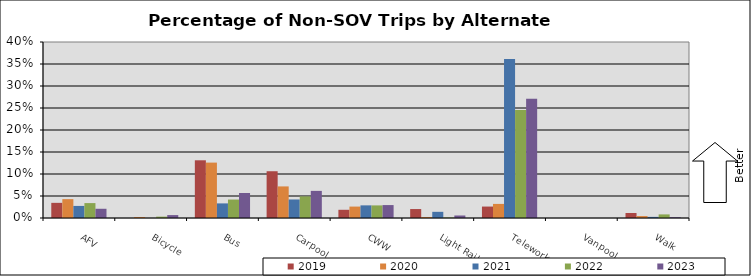
| Category | 2019 | 2020 | 2021 | 2022 | 2023 |
|---|---|---|---|---|---|
| AFV | 0.034 | 0.043 | 0.027 | 0.034 | 0.021 |
| Bicycle | 0 | 0.002 | 0 | 0.003 | 0.007 |
| Bus | 0.131 | 0.126 | 0.033 | 0.042 | 0.057 |
| Carpool | 0.106 | 0.072 | 0.042 | 0.049 | 0.062 |
| CWW | 0.019 | 0.026 | 0.029 | 0.029 | 0.029 |
| Light Rail | 0.02 | 0.002 | 0.014 | 0.001 | 0.006 |
| Telework | 0.026 | 0.032 | 0.361 | 0.245 | 0.271 |
| Vanpool | 0 | 0 | 0 | 0 | 0 |
| Walk | 0.011 | 0.004 | 0.003 | 0.008 | 0.002 |